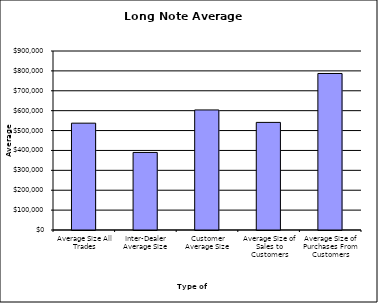
| Category | Security Type |
|---|---|
| Average Size All Trades | 537124.718 |
| Inter-Dealer Average Size | 389910.072 |
| Customer Average Size | 603601.591 |
| Average Size of Sales to Customers | 540992.763 |
| Average Size of Purchases From Customers | 786947.187 |